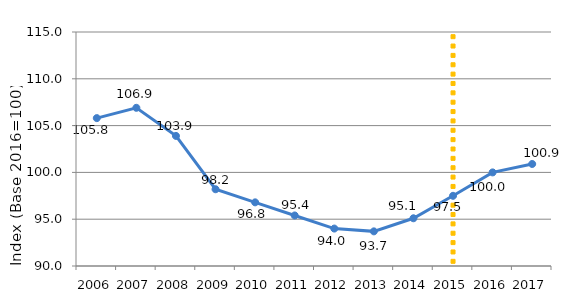
| Category | Series 39 | Series 38 | Series 1 | Series 2 | Series 3 | Series 30 | Series 4 | Series 29 | Series 31 | Series 32 | Series 33 | Series 34 | Series 35 | Series 36 | Series 37 | Series 40 | Series 41 | Series 42 | Series 43 | Series 44 | Series 45 | Series 46 | Series 47 | Series 48 | Series 49 | Series 50 | Series 51 | Series 52 | Series 53 | Series 0 |
|---|---|---|---|---|---|---|---|---|---|---|---|---|---|---|---|---|---|---|---|---|---|---|---|---|---|---|---|---|---|---|
| 2006.0 |  |  |  |  |  |  |  |  |  |  |  |  |  |  |  |  |  |  |  |  |  |  |  |  |  |  |  |  |  | 105.8 |
| 2007.0 |  |  |  |  |  |  |  |  |  |  |  |  |  |  |  |  |  |  |  |  |  |  |  |  |  |  |  |  |  | 106.9 |
| 2008.0 |  |  |  |  |  |  |  |  |  |  |  |  |  |  |  |  |  |  |  |  |  |  |  |  |  |  |  |  |  | 103.9 |
| 2009.0 |  |  |  |  |  |  |  |  |  |  |  |  |  |  |  |  |  |  |  |  |  |  |  |  |  |  |  |  |  | 98.2 |
| 2010.0 |  |  |  |  |  |  |  |  |  |  |  |  |  |  |  |  |  |  |  |  |  |  |  |  |  |  |  |  |  | 96.8 |
| 2011.0 |  |  |  |  |  |  |  |  |  |  |  |  |  |  |  |  |  |  |  |  |  |  |  |  |  |  |  |  |  | 95.4 |
| 2012.0 |  |  |  |  |  |  |  |  |  |  |  |  |  |  |  |  |  |  |  |  |  |  |  |  |  |  |  |  |  | 94 |
| 2013.0 |  |  |  |  |  |  |  |  |  |  |  |  |  |  |  |  |  |  |  |  |  |  |  |  |  |  |  |  |  | 93.7 |
| 2014.0 |  |  |  |  |  |  |  |  |  |  |  |  |  |  |  |  |  |  |  |  |  |  |  |  |  |  |  |  |  | 95.1 |
| 2015.0 |  |  |  |  |  |  |  |  |  |  |  |  |  |  |  |  |  |  |  |  |  |  |  |  |  |  |  |  |  | 97.5 |
| 2016.0 |  |  |  |  |  |  |  |  |  |  |  |  |  |  |  |  |  |  |  |  |  |  |  |  |  |  |  |  |  | 100 |
| 2017.0 |  |  |  |  |  |  |  |  |  |  |  |  |  |  |  |  |  |  |  |  |  |  |  |  |  |  |  |  |  | 100.9 |